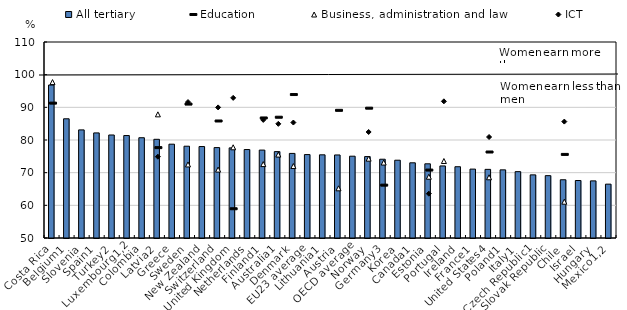
| Category | All tertiary |
|---|---|
| Costa Rica | 96.823 |
| Belgium1 | 86.495 |
| Slovenia | 83.09 |
| Spain1 | 82.167 |
| Turkey2 | 81.535 |
| Luxembourg1,2 | 81.367 |
| Colombia | 80.694 |
| Latvia2 | 80.214 |
| Greece | 78.719 |
| Sweden | 78.098 |
| New Zealand | 77.998 |
| Switzerland | 77.676 |
| United Kingdom | 77.586 |
| Netherlands | 77.081 |
| Finland1 | 76.914 |
| Australia1 | 76.445 |
| Denmark | 75.893 |
| EU23 average | 75.538 |
| Lithuania1 | 75.462 |
| Austria | 75.422 |
| OECD average | 75.04 |
| Norway | 74.928 |
| Germany3 | 74.115 |
| Korea | 73.812 |
| Canada1 | 73.018 |
| Estonia | 72.713 |
| Portugal | 72.063 |
| Ireland | 71.817 |
| France1 | 71.093 |
| United States4 | 71.011 |
| Poland1 | 70.864 |
| Italy1 | 70.311 |
| Czech Republic1 | 69.325 |
| Slovak Republic | 69.087 |
| Chile | 67.828 |
| Israel | 67.597 |
| Hungary | 67.485 |
| Mexico1,2 | 66.484 |